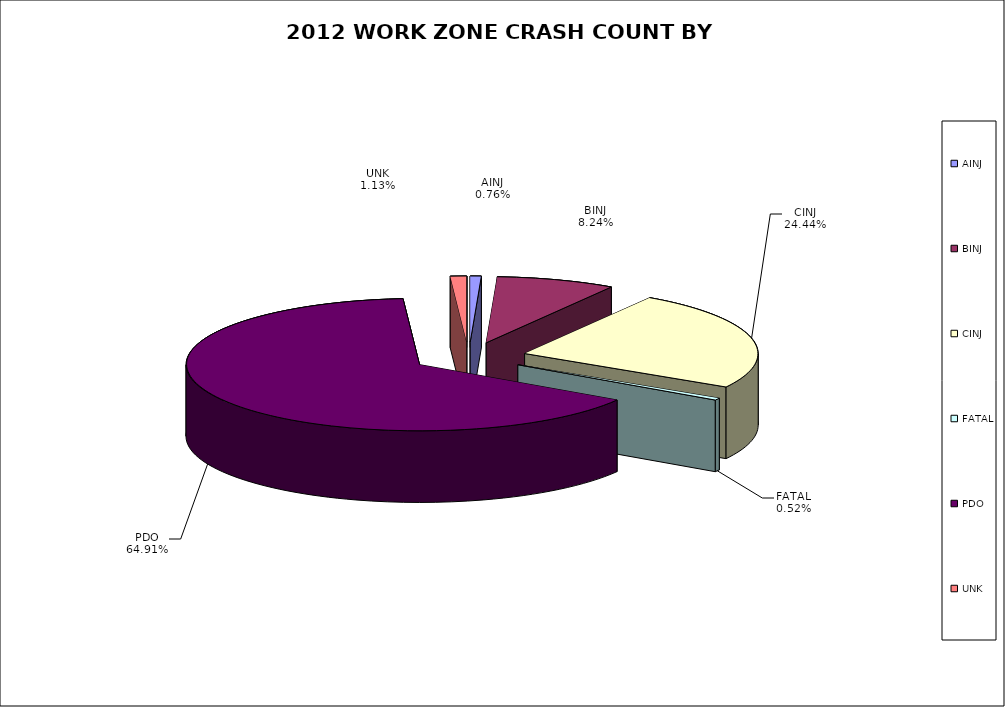
| Category | Series 0 | Series 1 |
|---|---|---|
| AINJ | 25 | 0.008 |
| BINJ | 270 | 0.082 |
| CINJ | 801 | 0.244 |
| FATAL | 17 | 0.005 |
| PDO | 2127 | 0.649 |
| UNK | 37 | 0.011 |